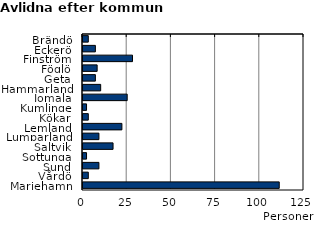
| Category | Series 0 |
|---|---|
| Brändö | 3 |
| Eckerö | 7 |
| Finström | 28 |
| Föglö | 8 |
| Geta | 7 |
| Hammarland | 10 |
| Jomala | 25 |
| Kumlinge | 2 |
| Kökar | 3 |
| Lemland | 22 |
| Lumparland | 9 |
| Saltvik | 17 |
| Sottunga | 2 |
| Sund | 9 |
| Vårdö | 3 |
| Mariehamn | 111 |